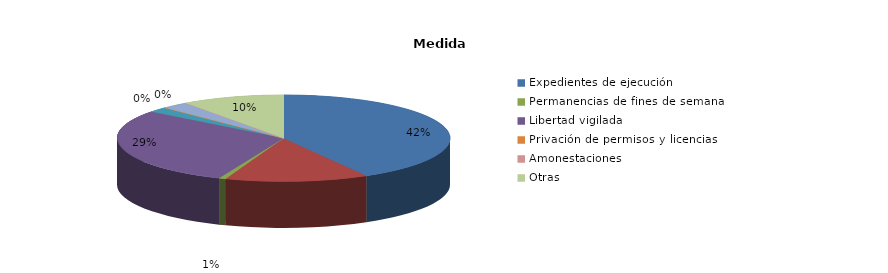
| Category | Series 0 |
|---|---|
| Expedientes de ejecución | 63 |
| Internamientos | 21 |
| Permanencias de fines de semana | 1 |
| Libertad vigilada | 44 |
| Prestaciones en beneficio de la comunidad | 3 |
| Privación de permisos y licencias | 0 |
| Convivencia Familiar Educativa | 4 |
| Amonestaciones | 0 |
| Otras | 15 |